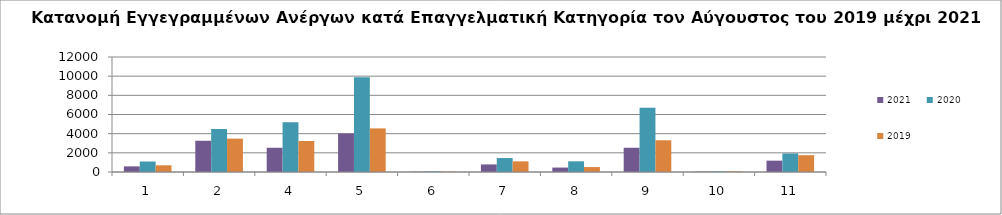
| Category | 2021 | 2020 | 2019 |
|---|---|---|---|
| 1.0 | 586 | 1095 | 699 |
| 2.0 | 3260 | 4486 | 3481 |
| 4.0 | 2528 | 5193 | 3236 |
| 5.0 | 4016 | 9889 | 4551 |
| 6.0 | 28 | 63 | 32 |
| 7.0 | 791 | 1458 | 1111 |
| 8.0 | 464 | 1115 | 515 |
| 9.0 | 2530 | 6701 | 3312 |
| 10.0 | 40 | 60 | 62 |
| 11.0 | 1183 | 1935 | 1754 |